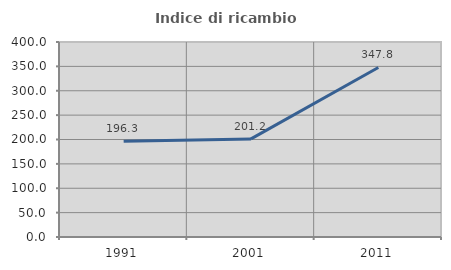
| Category | Indice di ricambio occupazionale  |
|---|---|
| 1991.0 | 196.33 |
| 2001.0 | 201.176 |
| 2011.0 | 347.761 |